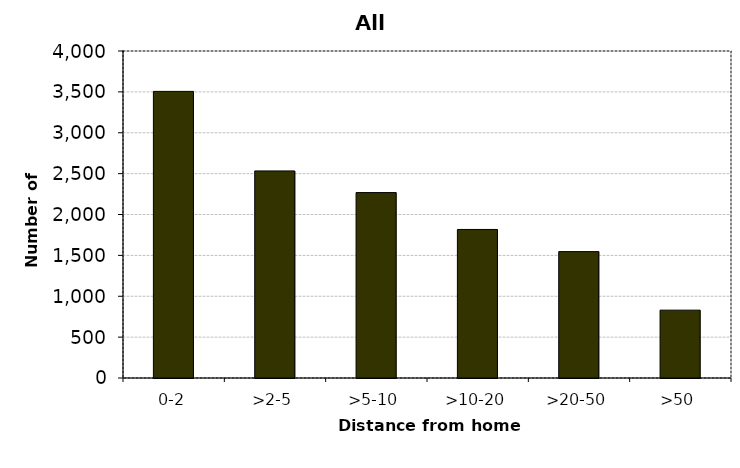
| Category | All drivers |
|---|---|
| 0-2 | 3506 |
| >2-5 | 2533 |
| >5-10 | 2268 |
| >10-20 | 1817 |
| >20-50 | 1546 |
| >50 | 830 |